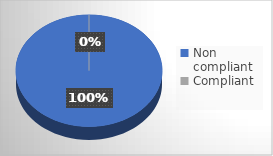
| Category | Series 0 |
|---|---|
| Non compliant | 22 |
| Compliant | 0 |